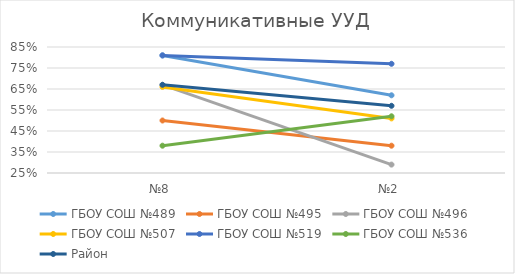
| Category | ГБОУ СОШ №489 | ГБОУ СОШ №495 | ГБОУ СОШ №496 | ГБОУ СОШ №507 | ГБОУ СОШ №519 | ГБОУ СОШ №536 | Район |
|---|---|---|---|---|---|---|---|
| №8 | 0.81 | 0.5 | 0.67 | 0.66 | 0.81 | 0.38 | 0.67 |
| №2 | 0.62 | 0.38 | 0.29 | 0.51 | 0.77 | 0.52 | 0.57 |